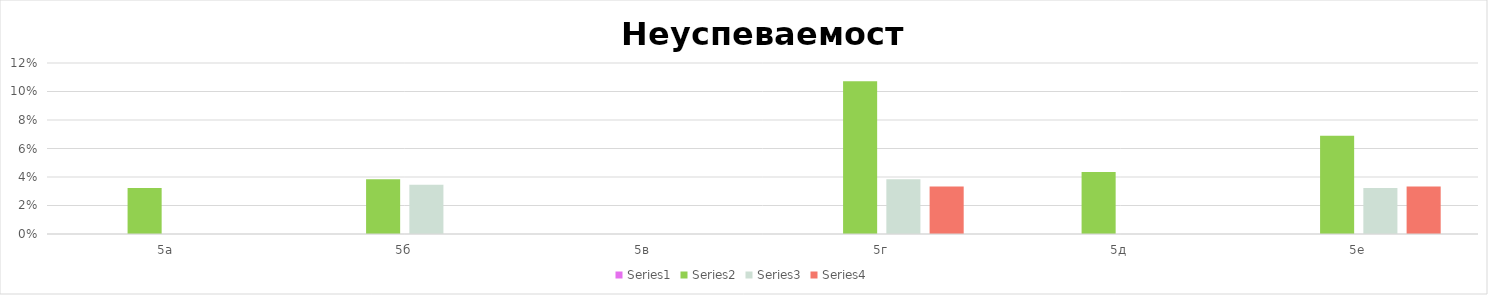
| Category | Series 0 | Series 1 | Series 2 | Series 3 | Series 4 |
|---|---|---|---|---|---|
| 5а |  | 0 | 0.032 | 0 | 0 |
| 5б |  | 0 | 0.038 | 0.034 | 0 |
| 5в |  | 0 | 0 | 0 | 0 |
| 5г |  | 0 | 0.107 | 0.038 | 0.033 |
| 5д |  | 0 | 0.043 | 0 | 0 |
| 5е |  | 0 | 0.069 | 0.032 | 0.033 |